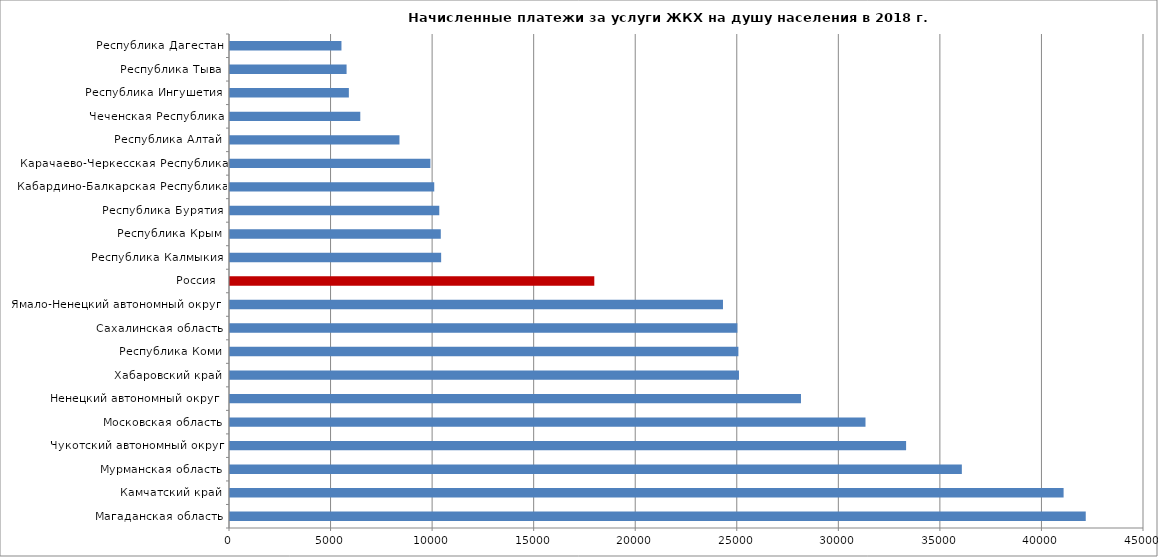
| Category | Платежи за ЖКХ на душу населения в год,  руб. |
|---|---|
| Магаданская область | 42132.067 |
| Камчатский край | 41041.264 |
| Мурманская область | 36031.517 |
| Чукотский автономный округ | 33287.242 |
| Московская область | 31288.062 |
| Ненецкий автономный округ  | 28111.481 |
| Хабаровский край | 25058.845 |
| Республика Коми | 25029.832 |
| Сахалинская область | 24980.592 |
| Ямало-Ненецкий автономный округ  | 24271.652 |
| Россия  | 17935.97 |
| Республика Калмыкия | 10395.627 |
| Республика Крым | 10378.465 |
| Республика Бурятия | 10303.88 |
| Кабардино-Балкарская Республика | 10055.692 |
| Карачаево-Черкесская Республика | 9865.325 |
| Республика Алтай | 8343.344 |
| Чеченская Республика | 6414.839 |
| Республика Ингушетия | 5851.944 |
| Республика Тыва | 5739.796 |
| Республика Дагестан | 5487.373 |